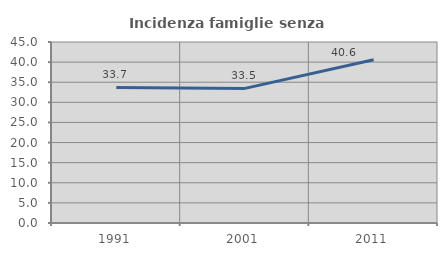
| Category | Incidenza famiglie senza nuclei |
|---|---|
| 1991.0 | 33.708 |
| 2001.0 | 33.466 |
| 2011.0 | 40.568 |